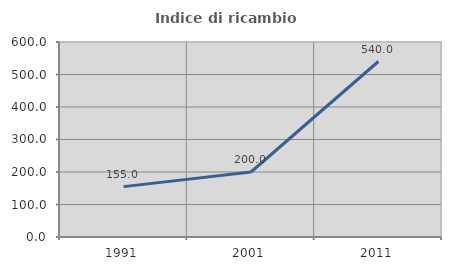
| Category | Indice di ricambio occupazionale  |
|---|---|
| 1991.0 | 155 |
| 2001.0 | 200 |
| 2011.0 | 540 |